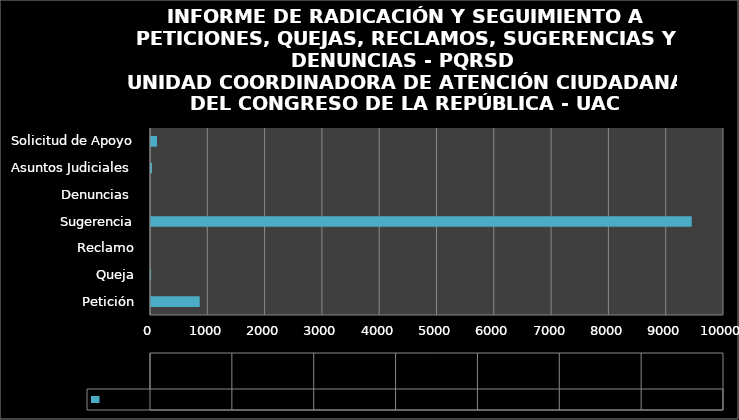
| Category | PQRSD |
|---|---|
| Petición | 850 |
| Queja | 1 |
| Reclamo | 0 |
| Sugerencia | 9437 |
| Denuncias  | 0 |
| Asuntos Judiciales  | 18 |
| Solicitud de Apoyo | 105 |